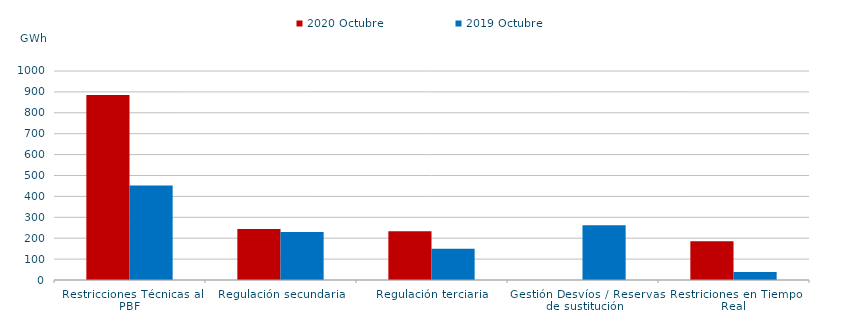
| Category | 2020 Octubre | 2019 Octubre |
|---|---|---|
| Restricciones Técnicas al PBF | 885.47 | 452.627 |
| Regulación secundaria | 243.534 | 230.091 |
| Regulación terciaria | 233.847 | 149.83 |
| Gestión Desvíos / Reservas de sustitución | 0 | 261.714 |
| Restriciones en Tiempo Real | 185.126 | 38.302 |